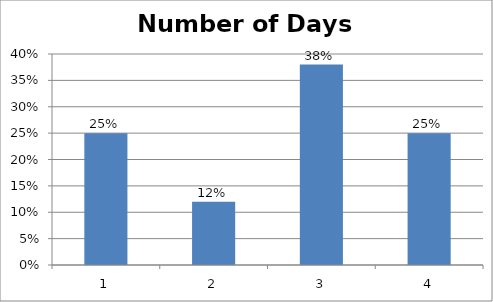
| Category | Number of Days (Theoretical) |
|---|---|
| 0 | 0.25 |
| 1 | 0.12 |
| 2 | 0.38 |
| 3 | 0.25 |